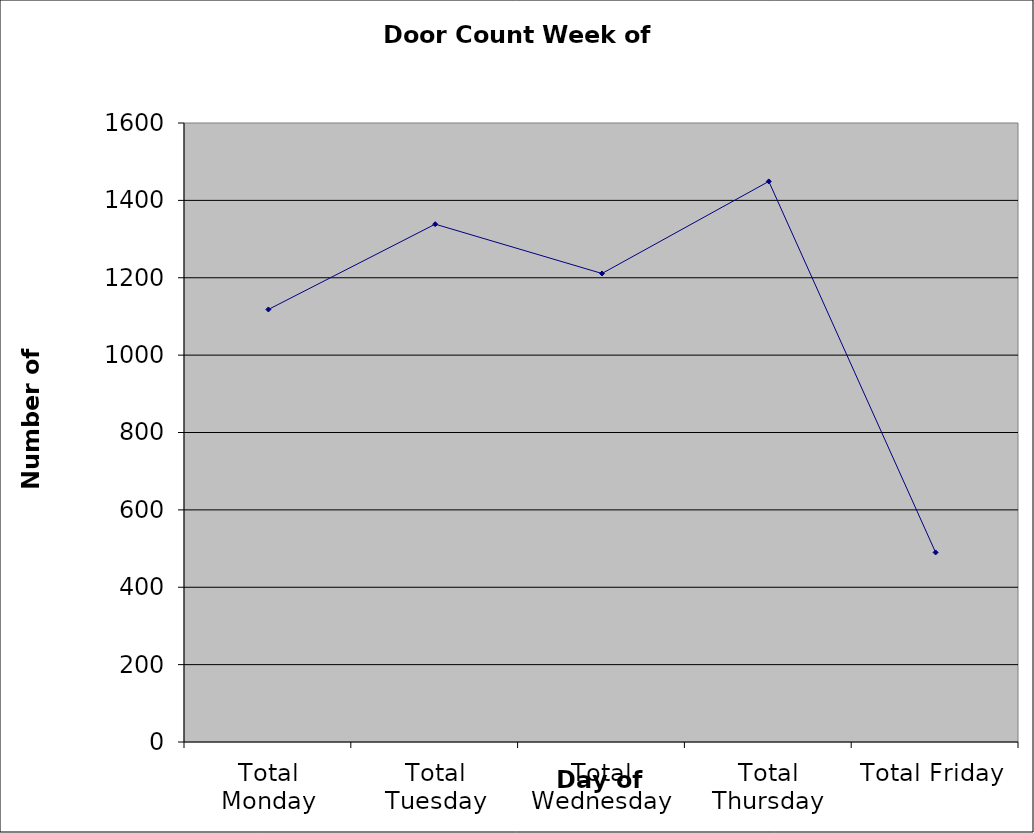
| Category | Series 0 |
|---|---|
| Total Monday | 1118 |
| Total Tuesday | 1338.5 |
| Total Wednesday | 1211 |
| Total Thursday | 1449 |
| Total Friday | 490 |